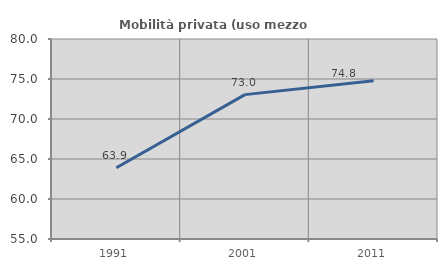
| Category | Mobilità privata (uso mezzo privato) |
|---|---|
| 1991.0 | 63.914 |
| 2001.0 | 73.046 |
| 2011.0 | 74.787 |